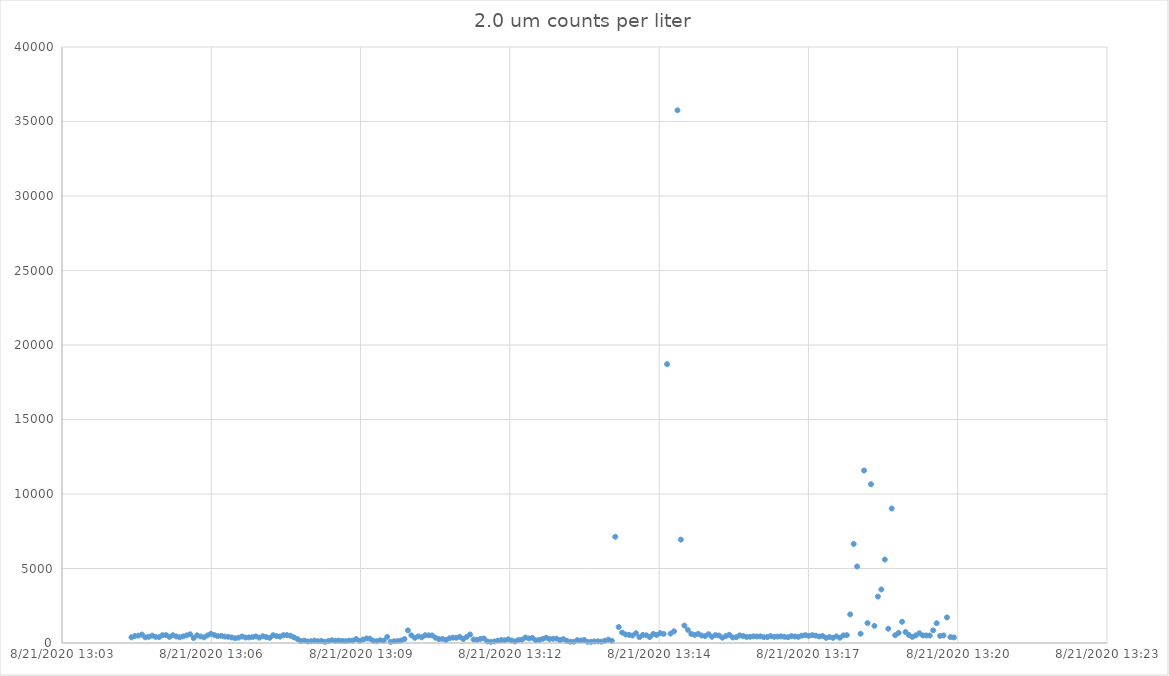
| Category | Series 0 |
|---|---|
| 44064.54493055555 | 381 |
| 44064.54497685185 | 466 |
| 44064.545023148145 | 494 |
| 44064.545069444444 | 565 |
| 44064.545115740744 | 381 |
| 44064.54516203704 | 416 |
| 44064.54520833334 | 494 |
| 44064.54525462963 | 409 |
| 44064.54530092593 | 395 |
| 44064.54534722222 | 522 |
| 44064.54539351852 | 529 |
| 44064.545439814814 | 409 |
| 44064.545486111114 | 522 |
| 44064.54553240741 | 438 |
| 44064.545578703706 | 388 |
| 44064.545625 | 445 |
| 44064.5456712963 | 515 |
| 44064.54571759259 | 586 |
| 44064.54576388889 | 332 |
| 44064.545810185184 | 515 |
| 44064.54585648148 | 438 |
| 44064.545902777776 | 381 |
| 44064.545949074076 | 508 |
| 44064.54599537037 | 621 |
| 44064.54604166667 | 529 |
| 44064.54608796296 | 459 |
| 44064.54613425926 | 480 |
| 44064.54618055555 | 430 |
| 44064.54622685185 | 416 |
| 44064.546273148146 | 374 |
| 44064.546319444446 | 317 |
| 44064.54636574074 | 360 |
| 44064.54641203704 | 438 |
| 44064.54645833333 | 367 |
| 44064.54650462963 | 374 |
| 44064.54655092592 | 395 |
| 44064.54659722222 | 445 |
| 44064.546643518515 | 360 |
| 44064.546689814815 | 452 |
| 44064.54673611111 | 395 |
| 44064.54678240741 | 346 |
| 44064.5468287037 | 522 |
| 44064.546875 | 459 |
| 44064.5469212963 | 430 |
| 44064.54696759259 | 529 |
| 44064.54701388889 | 529 |
| 44064.547060185185 | 487 |
| 44064.547106481485 | 381 |
| 44064.54715277778 | 275 |
| 44064.54719907408 | 134 |
| 44064.54724537037 | 162 |
| 44064.54729166667 | 105 |
| 44064.54733796296 | 120 |
| 44064.54738425926 | 162 |
| 44064.547430555554 | 120 |
| 44064.547476851854 | 141 |
| 44064.54752314815 | 77 |
| 44064.54756944445 | 134 |
| 44064.54761574074 | 183 |
| 44064.54766203704 | 148 |
| 44064.54770833333 | 162 |
| 44064.54775462963 | 141 |
| 44064.547800925924 | 127 |
| 44064.547847222224 | 162 |
| 44064.54789351852 | 162 |
| 44064.547939814816 | 268 |
| 44064.54798611111 | 148 |
| 44064.54803240741 | 226 |
| 44064.5480787037 | 303 |
| 44064.548125 | 289 |
| 44064.548171296294 | 141 |
| 44064.54821759259 | 120 |
| 44064.548263888886 | 183 |
| 44064.548310185186 | 155 |
| 44064.54835648148 | 409 |
| 44064.54840277778 | 77 |
| 44064.54844907407 | 120 |
| 44064.54849537037 | 127 |
| 44064.54854166666 | 169 |
| 44064.54858796296 | 268 |
| 44064.548634259256 | 847 |
| 44064.548680555556 | 515 |
| 44064.548726851855 | 346 |
| 44064.54877314815 | 445 |
| 44064.54881944445 | 381 |
| 44064.54886574074 | 522 |
| 44064.54891203704 | 515 |
| 44064.54895833333 | 508 |
| 44064.54900462963 | 353 |
| 44064.549050925925 | 261 |
| 44064.549097222225 | 275 |
| 44064.54914351852 | 204 |
| 44064.54918981482 | 317 |
| 44064.54923611111 | 360 |
| 44064.54928240741 | 353 |
| 44064.5493287037 | 409 |
| 44064.549375 | 261 |
| 44064.549421296295 | 409 |
| 44064.549467592595 | 572 |
| 44064.54951388889 | 233 |
| 44064.54956018519 | 219 |
| 44064.54960648148 | 275 |
| 44064.54965277778 | 303 |
| 44064.54969907407 | 105 |
| 44064.54974537037 | 77 |
| 44064.549791666665 | 105 |
| 44064.549837962964 | 162 |
| 44064.54988425926 | 197 |
| 44064.54993055556 | 183 |
| 44064.54997685185 | 247 |
| 44064.55002314815 | 169 |
| 44064.55006944444 | 105 |
| 44064.55011574074 | 204 |
| 44064.550162037034 | 219 |
| 44064.550208333334 | 367 |
| 44064.55025462963 | 303 |
| 44064.55030092593 | 346 |
| 44064.55034722222 | 183 |
| 44064.55039351852 | 211 |
| 44064.55043981481 | 275 |
| 44064.55048611111 | 353 |
| 44064.550532407404 | 261 |
| 44064.550578703704 | 282 |
| 44064.550625 | 296 |
| 44064.550671296296 | 197 |
| 44064.550717592596 | 261 |
| 44064.55076388889 | 141 |
| 44064.55081018519 | 91 |
| 44064.55085648148 | 84 |
| 44064.55090277778 | 190 |
| 44064.55094907407 | 169 |
| 44064.55099537037 | 204 |
| 44064.551041666666 | 77 |
| 44064.551087962966 | 77 |
| 44064.55113425926 | 105 |
| 44064.55118055556 | 113 |
| 44064.55122685185 | 91 |
| 44064.55127314815 | 155 |
| 44064.55131944444 | 226 |
| 44064.55136574074 | 148 |
| 44064.551412037035 | 7128 |
| 44064.551458333335 | 1073 |
| 44064.55150462963 | 699 |
| 44064.55155092593 | 572 |
| 44064.55159722222 | 543 |
| 44064.55164351852 | 501 |
| 44064.55168981481 | 657 |
| 44064.55173611111 | 395 |
| 44064.551782407405 | 543 |
| 44064.551828703705 | 515 |
| 44064.551875 | 402 |
| 44064.5519212963 | 607 |
| 44064.55196759259 | 543 |
| 44064.55201388889 | 657 |
| 44064.55206018518 | 614 |
| 44064.55210648148 | 18714 |
| 44064.552152777775 | 628 |
| 44064.552199074074 | 784 |
| 44064.55224537037 | 35754 |
| 44064.55229166667 | 6937 |
| 44064.55233796296 | 1172 |
| 44064.55238425926 | 883 |
| 44064.55243055556 | 607 |
| 44064.55247685185 | 543 |
| 44064.55252314815 | 614 |
| 44064.552569444444 | 501 |
| 44064.552615740744 | 466 |
| 44064.55266203704 | 593 |
| 44064.552708333336 | 416 |
| 44064.55275462963 | 529 |
| 44064.55280092593 | 501 |
| 44064.55284722222 | 360 |
| 44064.55289351852 | 459 |
| 44064.552939814814 | 551 |
| 44064.55298611111 | 374 |
| 44064.553032407406 | 388 |
| 44064.553078703706 | 508 |
| 44064.553125 | 466 |
| 44064.5531712963 | 409 |
| 44064.55321759259 | 416 |
| 44064.55326388889 | 445 |
| 44064.55331018518 | 438 |
| 44064.55335648148 | 445 |
| 44064.553402777776 | 395 |
| 44064.553449074076 | 402 |
| 44064.55349537037 | 459 |
| 44064.55354166667 | 416 |
| 44064.55358796296 | 430 |
| 44064.55363425926 | 445 |
| 44064.55368055555 | 416 |
| 44064.55372685185 | 388 |
| 44064.553773148145 | 459 |
| 44064.553819444445 | 438 |
| 44064.55386574074 | 416 |
| 44064.55391203704 | 494 |
| 44064.55395833333 | 529 |
| 44064.55400462963 | 480 |
| 44064.55405092592 | 529 |
| 44064.55409722222 | 494 |
| 44064.554143518515 | 438 |
| 44064.554189814815 | 473 |
| 44064.554236111115 | 346 |
| 44064.55428240741 | 402 |
| 44064.55432870371 | 346 |
| 44064.554375 | 445 |
| 44064.5544212963 | 353 |
| 44064.55446759259 | 508 |
| 44064.55451388889 | 529 |
| 44064.554560185185 | 1921 |
| 44064.554606481484 | 6647 |
| 44064.55465277778 | 5135 |
| 44064.55469907408 | 621 |
| 44064.55474537037 | 11578 |
| 44064.55479166667 | 1335 |
| 44064.55483796296 | 10653 |
| 44064.55488425926 | 1151 |
| 44064.554930555554 | 3115 |
| 44064.554976851854 | 3595 |
| 44064.55502314815 | 5602 |
| 44064.55506944445 | 960 |
| 44064.55511574074 | 9028 |
| 44064.55516203704 | 522 |
| 44064.55520833333 | 678 |
| 44064.55525462963 | 1427 |
| 44064.555300925924 | 741 |
| 44064.555347222224 | 536 |
| 44064.555393518516 | 409 |
| 44064.555439814816 | 515 |
| 44064.55548611111 | 657 |
| 44064.55553240741 | 508 |
| 44064.5555787037 | 508 |
| 44064.555625 | 501 |
| 44064.55567129629 | 847 |
| 44064.55571759259 | 1328 |
| 44064.555763888886 | 480 |
| 44064.555810185186 | 508 |
| 44064.55585648148 | 1716 |
| 44064.55590277778 | 395 |
| 44064.55594907407 | 374 |